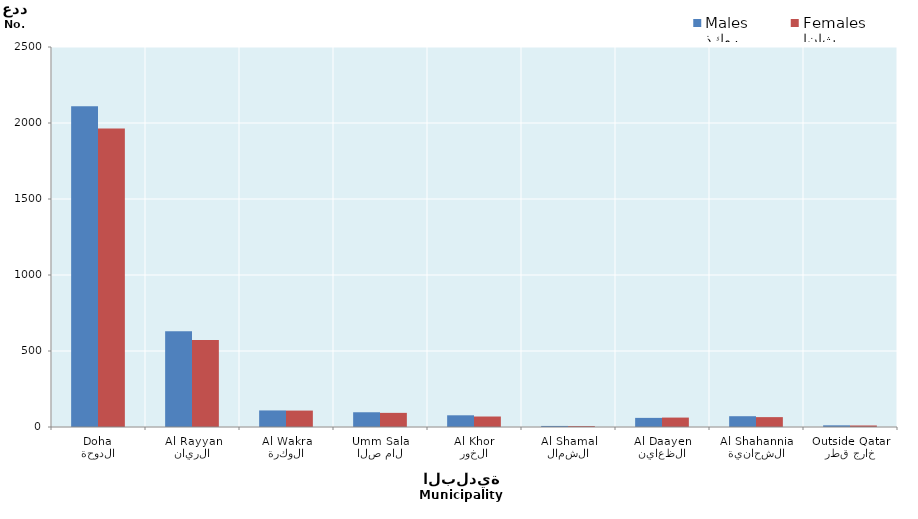
| Category | ذكور
Males | إناث
Females |
|---|---|---|
| الدوحة
Doha | 2111 | 1963 |
| الريان
Al Rayyan | 630 | 573 |
| الوكرة
Al Wakra | 109 | 108 |
| ام صلال
Umm Salal | 97 | 93 |
| الخور
Al Khor | 77 | 69 |
| الشمال
Al Shamal | 7 | 6 |
| الظعاين
Al Daayen | 60 | 62 |
| الشحانية
Al Shahannia | 71 | 65 |
| خارج قطر
Outside Qatar | 11 | 10 |